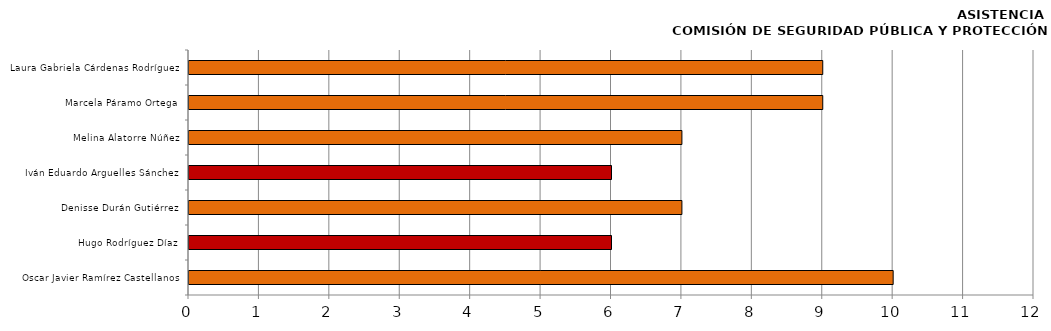
| Category | Series 0 |
|---|---|
| Oscar Javier Ramírez Castellanos | 10 |
| Hugo Rodríguez Díaz | 6 |
| Denisse Durán Gutiérrez | 7 |
| Iván Eduardo Arguelles Sánchez | 6 |
| Melina Alatorre Núñez | 7 |
| Marcela Páramo Ortega | 9 |
| Laura Gabriela Cárdenas Rodríguez | 9 |